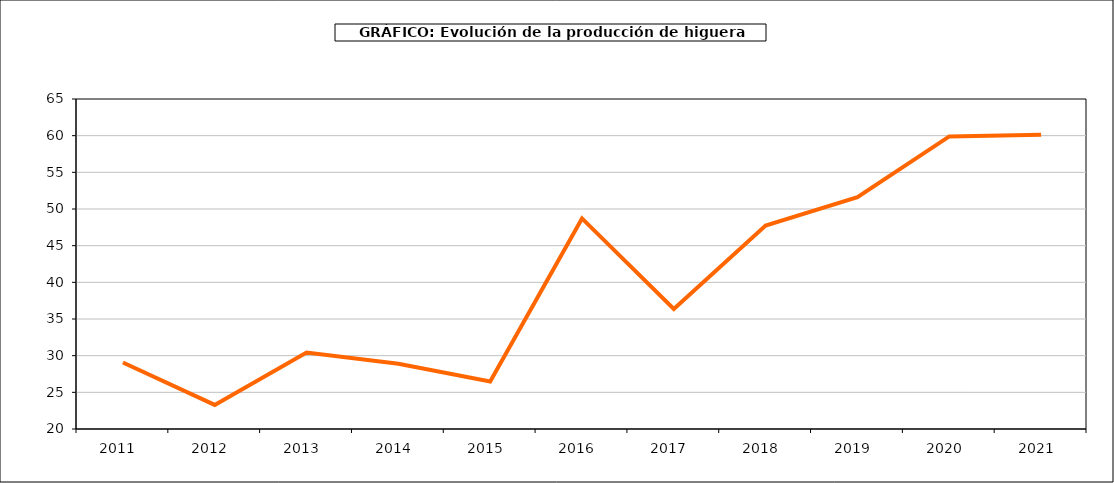
| Category | producción higuera |
|---|---|
| 2011.0 | 29.071 |
| 2012.0 | 23.285 |
| 2013.0 | 30.434 |
| 2014.0 | 28.893 |
| 2015.0 | 26.479 |
| 2016.0 | 48.718 |
| 2017.0 | 36.38 |
| 2018.0 | 47.75 |
| 2019.0 | 51.598 |
| 2020.0 | 59.9 |
| 2021.0 | 60.13 |